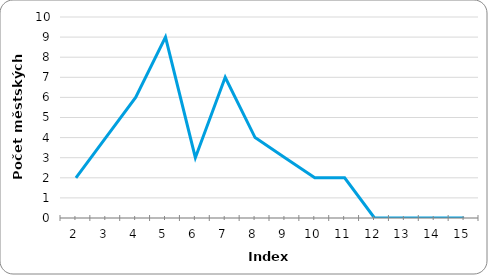
| Category | Series 0 |
|---|---|
| 2.0 | 2 |
| 3.0 | 4 |
| 4.0 | 6 |
| 5.0 | 9 |
| 6.0 | 3 |
| 7.0 | 7 |
| 8.0 | 4 |
| 9.0 | 3 |
| 10.0 | 2 |
| 11.0 | 2 |
| 12.0 | 0 |
| 13.0 | 0 |
| 14.0 | 0 |
| 15.0 | 0 |